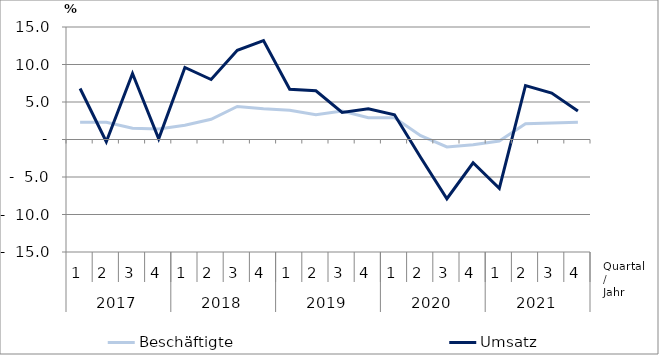
| Category | Beschäftigte | Umsatz |
|---|---|---|
| 0 | 2.3 | 6.8 |
| 1 | 2.3 | -0.3 |
| 2 | 1.5 | 8.8 |
| 3 | 1.4 | 0.1 |
| 4 | 1.9 | 9.6 |
| 5 | 2.7 | 8 |
| 6 | 4.4 | 11.9 |
| 7 | 4.1 | 13.2 |
| 8 | 3.9 | 6.7 |
| 9 | 3.3 | 6.5 |
| 10 | 3.8 | 3.6 |
| 11 | 2.9 | 4.1 |
| 12 | 2.9 | 3.3 |
| 13 | 0.5 | -2.4 |
| 14 | -1 | -7.9 |
| 15 | -0.7 | -3.1 |
| 16 | -0.2 | -6.5 |
| 17 | 2.1 | 7.2 |
| 18 | 2.2 | 6.2 |
| 19 | 2.3 | 3.8 |